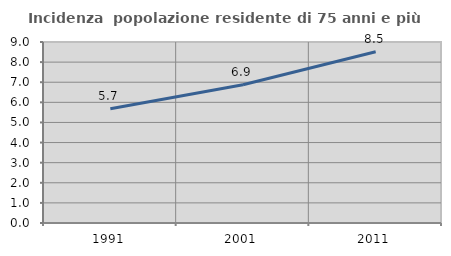
| Category | Incidenza  popolazione residente di 75 anni e più |
|---|---|
| 1991.0 | 5.676 |
| 2001.0 | 6.871 |
| 2011.0 | 8.519 |